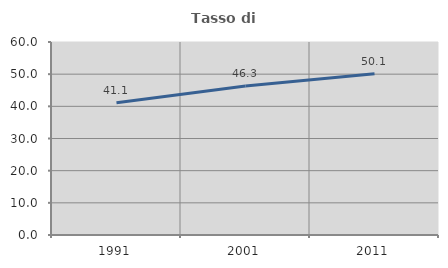
| Category | Tasso di occupazione   |
|---|---|
| 1991.0 | 41.13 |
| 2001.0 | 46.327 |
| 2011.0 | 50.102 |